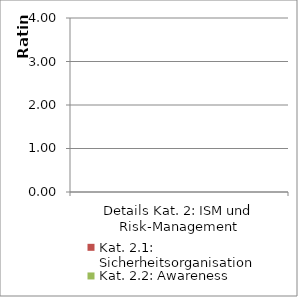
| Category | Kat. 2.1: Sicherheitsorganisation | Kat. 2.2: Awareness |
|---|---|---|
| Details Kat. 2: ISM und Risk-Management | 0 | 0 |